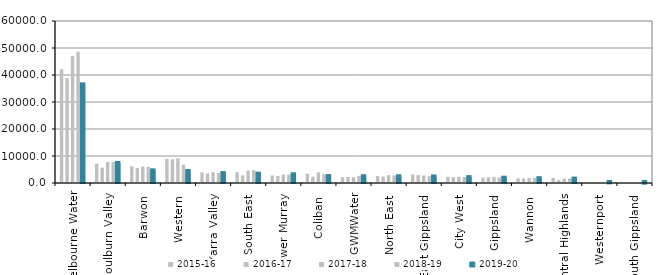
| Category | 2015-16 | 2016-17 | 2017-18 | 2018-19 | 2019-20 |
|---|---|---|---|---|---|
| Melbourne Water | 42167 | 38846 | 47038 | 48624 | 36529.7 |
| Goulburn Valley  | 7194.067 | 5698 | 7753.7 | 7821.29 | 7401.44 |
| Barwon  | 6182.876 | 5538.102 | 6070 | 5997.717 | 4683.041 |
| Western  | 8955.76 | 8814.702 | 9176 | 6793 | 4429 |
| Yarra Valley  | 3905.7 | 3551.2 | 4018.7 | 3720.784 | 3666.041 |
| South East  | 3967.822 | 2825.716 | 4562.51 | 4785.75 | 3472.8 |
| Lower Murray  | 2790.5 | 2622.5 | 3159 | 3110.337 | 3227.753 |
| Coliban  | 3443.695 | 2334.7 | 3960 | 3261.4 | 2562.61 |
| GWMWater | 2108.109 | 2207.8 | 2147.24 | 2568.62 | 2509.354 |
| North East  | 2590.32 | 2391.08 | 2925.9 | 2810.58 | 2487.775 |
| East Gippsland  | 3171.98 | 2932.766 | 2773 | 2496.222 | 2437.581 |
| City West  | 2285.23 | 2131.734 | 2350.41 | 2232 | 2183.46 |
| Gippsland  | 1957 | 2168.007 | 2291.096 | 2054.436 | 1968.857 |
| Wannon  | 1727.7 | 1656.001 | 1788.1 | 1915.361 | 1773.1 |
| Central Highlands  | 1897.624 | 1104 | 1593.054 | 1680.245 | 1625.6 |
| Westernport  | 295 | 287.734 | 328.852 | 340.435 | 236.886 |
| South Gippsland  | 220.762 | 136.1 | 123.3 | 124 | 121.96 |